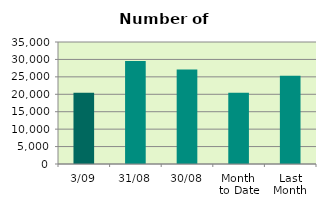
| Category | Series 0 |
|---|---|
| 3/09 | 20464 |
| 31/08 | 29558 |
| 30/08 | 27114 |
| Month 
to Date | 20464 |
| Last
Month | 25327.391 |